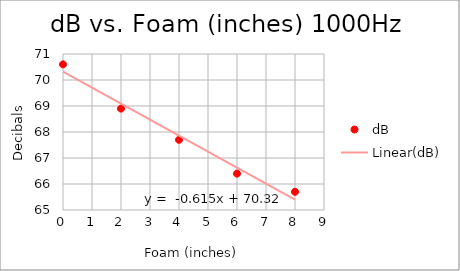
| Category | dB |
|---|---|
| 0.0 | 70.6 |
| 2.0 | 68.9 |
| 4.0 | 67.7 |
| 6.0 | 66.4 |
| 8.0 | 65.7 |